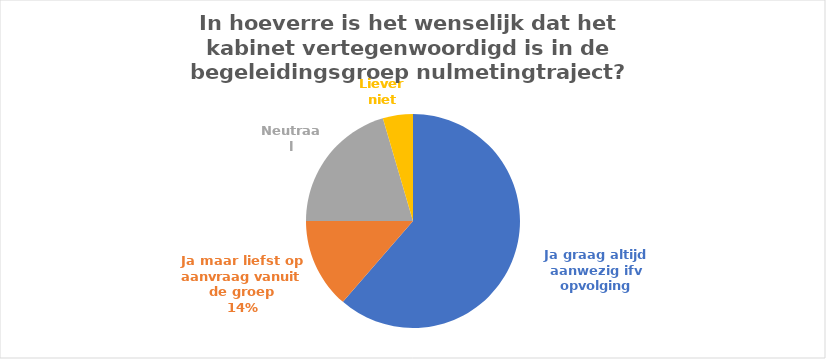
| Category | Votes |
|---|---|
| Ja graag altijd aanwezig ifv opvolging | 27 |
| Ja maar liefst op aanvraag vanuit de groep | 6 |
| Neutraal | 9 |
| Liever niet | 2 |